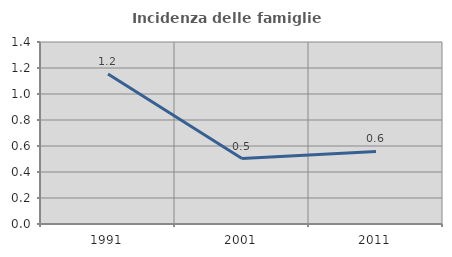
| Category | Incidenza delle famiglie numerose |
|---|---|
| 1991.0 | 1.155 |
| 2001.0 | 0.504 |
| 2011.0 | 0.558 |